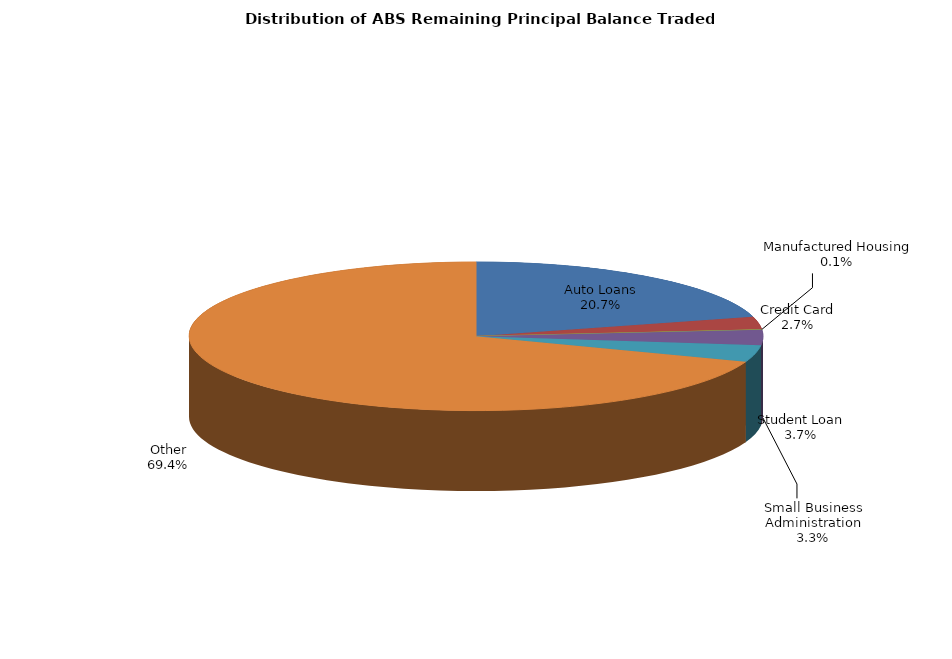
| Category | Series 0 |
|---|---|
| Auto Loans | 464621440.873 |
| Credit Card | 60915153.339 |
| Manufactured Housing | 3070220.169 |
| Small Business Administration | 74234381.809 |
| Student Loan | 81861842.824 |
| Other | 1554558849.341 |